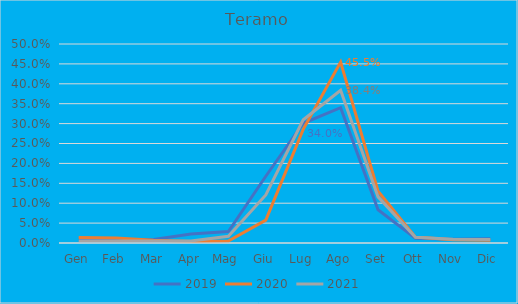
| Category | 2019 | 2020 | 2021 |
|---|---|---|---|
| Gen | 0.008 | 0.014 | 0.005 |
| Feb | 0.008 | 0.012 | 0.005 |
| Mar | 0.009 | 0.007 | 0.005 |
| Apr | 0.023 | 0.004 | 0.005 |
| Mag | 0.029 | 0.005 | 0.017 |
| Giu | 0.168 | 0.057 | 0.121 |
| Lug | 0.301 | 0.286 | 0.31 |
| Ago | 0.34 | 0.455 | 0.384 |
| Set | 0.084 | 0.13 | 0.116 |
| Ott | 0.012 | 0.015 | 0.014 |
| Nov | 0.009 | 0.008 | 0.01 |
| Dic | 0.011 | 0.007 | 0.009 |